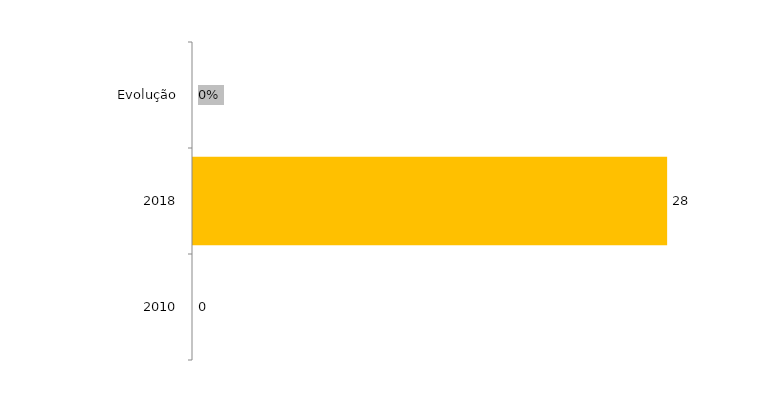
| Category | Evolução Concluintes |
|---|---|
| 2010 | 0 |
| 2018 | 28 |
| Evolução | 0 |